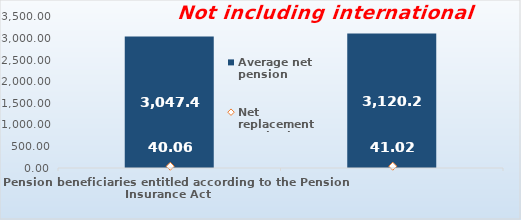
| Category | Average net pension  |
|---|---|
| Pension beneficiaries entitled according to the Pension Insurance Act   | 3047.41 |
| Pension beneficiaries entitled to pension FOR THE FIRST TIME in 2022 according to the Pension Insurance Act  - NEW BENEFICIARIES | 3120.281 |